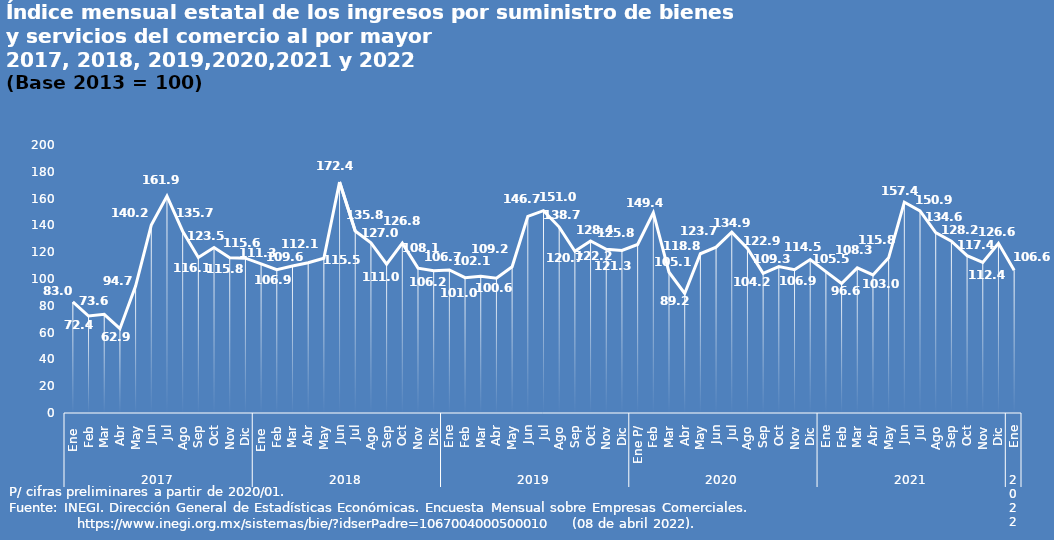
| Category | Series 0 |
|---|---|
| 0 | 82.996 |
| 1 | 72.378 |
| 2 | 73.596 |
| 3 | 62.919 |
| 4 | 94.702 |
| 5 | 140.201 |
| 6 | 161.866 |
| 7 | 135.662 |
| 8 | 116.081 |
| 9 | 123.533 |
| 10 | 115.846 |
| 11 | 115.557 |
| 12 | 111.311 |
| 13 | 106.918 |
| 14 | 109.647 |
| 15 | 112.114 |
| 16 | 115.484 |
| 17 | 172.363 |
| 18 | 135.802 |
| 19 | 126.991 |
| 20 | 111.037 |
| 21 | 126.804 |
| 22 | 108.087 |
| 23 | 106.187 |
| 24 | 106.74 |
| 25 | 100.963 |
| 26 | 102.089 |
| 27 | 100.563 |
| 28 | 109.169 |
| 29 | 146.701 |
| 30 | 150.996 |
| 31 | 138.744 |
| 32 | 120.693 |
| 33 | 128.352 |
| 34 | 122.166 |
| 35 | 121.287 |
| 36 | 125.787 |
| 37 | 149.448 |
| 38 | 105.055 |
| 39 | 89.179 |
| 40 | 118.844 |
| 41 | 123.747 |
| 42 | 134.939 |
| 43 | 122.859 |
| 44 | 104.173 |
| 45 | 109.284 |
| 46 | 106.911 |
| 47 | 114.55 |
| 48 | 105.472 |
| 49 | 96.603 |
| 50 | 108.291 |
| 51 | 103.013 |
| 52 | 115.779 |
| 53 | 157.362 |
| 54 | 150.851 |
| 55 | 134.561 |
| 56 | 128.228 |
| 57 | 117.384 |
| 58 | 112.424 |
| 59 | 126.643 |
| 60 | 106.571 |